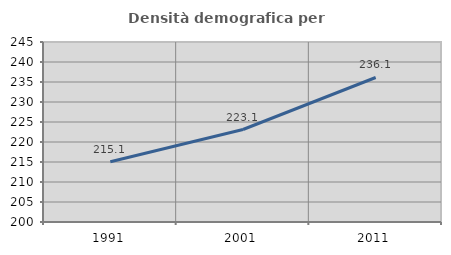
| Category | Densità demografica |
|---|---|
| 1991.0 | 215.068 |
| 2001.0 | 223.123 |
| 2011.0 | 236.13 |